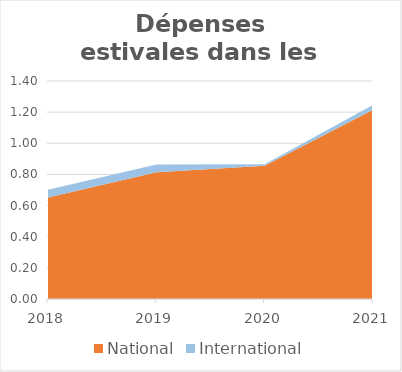
| Category | National | International |
|---|---|---|
| 2018.0 | 0.652 | 0.05 |
| 2019.0 | 0.814 | 0.05 |
| 2020.0 | 0.856 | 0.01 |
| 2021.0 | 1.216 | 0.03 |